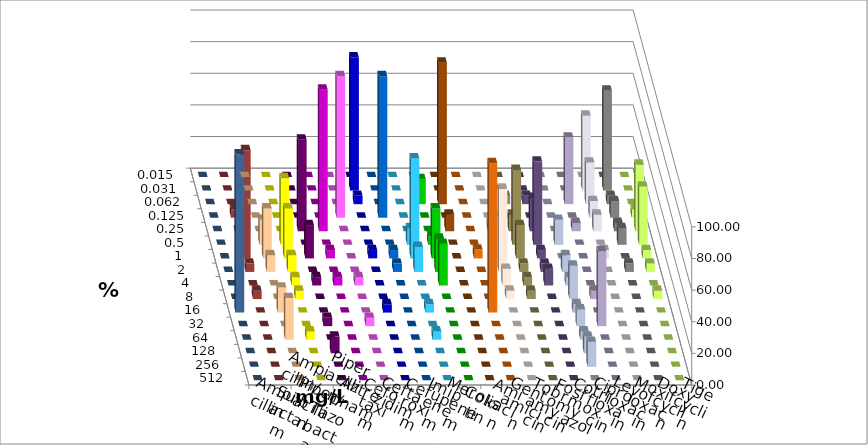
| Category | Ampicillin | Ampicillin/ Sulbactam | Piperacillin | Piperacillin/ Tazobactam | Aztreonam | Cefotaxim | Ceftazidim | Cefuroxim | Imipenem | Meropenem | Colistin | Amikacin | Gentamicin | Tobramycin | Fosfomycin | Cotrimoxazol | Ciprofloxacin | Levofloxacin | Moxifloxacin | Doxycyclin | Tigecyclin |
|---|---|---|---|---|---|---|---|---|---|---|---|---|---|---|---|---|---|---|---|---|---|
| 0.015 | 0 | 0 | 0 | 0 | 0 | 0 | 0 | 0 | 0 | 0 | 0 | 0 | 0 | 0 | 0 | 0 | 0 | 0 | 0 | 0 | 0 |
| 0.031 | 0 | 0 | 0 | 0 | 0 | 84.211 | 0 | 0 | 0 | 0 | 0 | 0 | 0 | 0 | 0 | 0 | 47.368 | 63.158 | 0 | 0 | 0 |
| 0.062 | 0 | 0 | 0 | 0 | 0 | 5.263 | 0 | 0 | 15.789 | 89.474 | 0 | 0 | 5.263 | 5.263 | 0 | 42.105 | 26.316 | 5.263 | 0 | 0 | 0 |
| 0.125 | 0 | 0 | 0 | 0 | 89.474 | 0 | 89.474 | 0 | 0 | 0 | 0 | 0 | 0 | 0 | 0 | 0 | 10.526 | 10.526 | 5.263 | 0 | 5.263 |
| 0.25 | 0 | 0 | 57.895 | 89.474 | 0 | 0 | 0 | 0 | 0 | 10.526 | 0 | 5.263 | 10.526 | 21.053 | 0 | 5.263 | 10.526 | 5.263 | 42.105 | 0 | 0 |
| 0.5 | 15.789 | 42.105 | 0 | 0 | 0 | 0 | 0 | 10.526 | 5.263 | 0 | 0 | 0 | 47.368 | 52.632 | 15.789 | 0 | 0 | 10.526 | 36.842 | 0 | 15.789 |
| 1.0 | 31.579 | 31.579 | 21.053 | 5.263 | 0 | 5.263 | 5.263 | 63.158 | 31.579 | 0 | 5.556 | 26.316 | 21.053 | 5.263 | 0 | 0 | 5.263 | 0 | 5.263 | 0 | 68.421 |
| 2.0 | 10.526 | 10.526 | 0 | 0 | 0 | 0 | 5.263 | 15.789 | 21.053 | 0 | 0 | 52.632 | 5.263 | 5.263 | 10.526 | 0 | 0 | 5.263 | 5.263 | 0 | 5.263 |
| 4.0 | 0 | 5.263 | 5.263 | 5.263 | 5.263 | 0 | 0 | 0 | 26.316 | 0 | 0 | 10.526 | 5.263 | 10.526 | 5.263 | 0 | 0 | 0 | 0 | 0 | 0 |
| 8.0 | 0 | 5.263 | 0 | 0 | 0 | 0 | 0 | 0 | 0 | 0 | 0 | 5.263 | 5.263 | 0 | 21.053 | 5.263 | 0 | 0 | 5.263 | 0 | 5.263 |
| 16.0 | 15.789 | 0 | 0 | 0 | 0 | 5.263 | 0 | 5.263 | 0 | 0 | 94.444 | 0 | 0 | 0 | 5.263 | 0 | 0 | 0 | 0 | 100 | 0 |
| 32.0 | 0 | 0 | 5.263 | 0 | 5.263 | 0 | 0 | 0 | 0 | 0 | 0 | 0 | 0 | 0 | 10.526 | 47.368 | 0 | 0 | 0 | 0 | 0 |
| 64.0 | 26.316 | 5.263 | 0 | 0 | 0 | 0 | 0 | 5.263 | 0 | 0 | 0 | 0 | 0 | 0 | 5.263 | 0 | 0 | 0 | 0 | 0 | 0 |
| 128.0 | 0 | 0 | 10.526 | 0 | 0 | 0 | 0 | 0 | 0 | 0 | 0 | 0 | 0 | 0 | 10.526 | 0 | 0 | 0 | 0 | 0 | 0 |
| 256.0 | 0 | 0 | 0 | 0 | 0 | 0 | 0 | 0 | 0 | 0 | 0 | 0 | 0 | 0 | 15.789 | 0 | 0 | 0 | 0 | 0 | 0 |
| 512.0 | 0 | 0 | 0 | 0 | 0 | 0 | 0 | 0 | 0 | 0 | 0 | 0 | 0 | 0 | 0 | 0 | 0 | 0 | 0 | 0 | 0 |